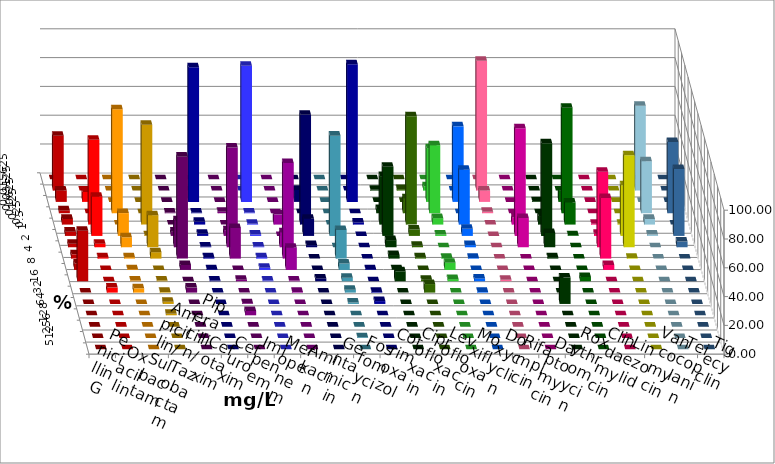
| Category | Penicillin G | Oxacillin | Ampicillin/ Sulbactam | Piperacillin/ Tazobactam | Cefotaxim | Cefuroxim | Imipenem | Meropenem | Amikacin | Gentamicin | Fosfomycin | Cotrimoxazol | Ciprofloxacin | Levofloxacin | Moxifloxacin | Doxycyclin | Rifampicin | Daptomycin | Roxythromycin | Clindamycin | Linezolid | Vancomycin | Teicoplanin | Tigecyclin |
|---|---|---|---|---|---|---|---|---|---|---|---|---|---|---|---|---|---|---|---|---|---|---|---|---|
| 0.015625 | 0 | 0 | 0 | 0 | 0 | 0 | 0 | 0 | 0 | 0 | 0 | 0 | 0 | 0 | 0 | 0 | 0 | 0 | 0 | 0 | 0 | 0 | 0 | 0 |
| 0.03125 | 38.119 | 0 | 0 | 0 | 0 | 0 | 0 | 0 | 0 | 0 | 0 | 0 | 0.495 | 0.99 | 2.985 | 0 | 90.099 | 0 | 0 | 0 | 0 | 0 | 0 | 58.911 |
| 0.0625 | 7.921 | 6.931 | 0 | 0 | 0 | 0 | 93.564 | 94.554 | 0 | 8.416 | 0 | 95.545 | 0 | 0 | 37.313 | 52.475 | 7.921 | 0 | 0.495 | 7.921 | 0 | 0 | 0 | 0 |
| 0.125 | 1.98 | 0 | 72.277 | 0 | 0.495 | 0.99 | 0.495 | 0.495 | 0 | 0 | 0 | 0 | 2.97 | 10.396 | 47.264 | 0 | 0.99 | 0 | 0 | 73.267 | 0 | 0 | 49.505 | 36.139 |
| 0.25 | 3.96 | 58.911 | 0 | 69.307 | 0 | 0 | 1.98 | 0.495 | 6.931 | 76.238 | 0 | 1.485 | 33.663 | 75.248 | 4.478 | 38.119 | 0 | 4.95 | 5.941 | 15.347 | 0.495 | 0.495 | 0 | 3.96 |
| 0.5 | 2.97 | 27.228 | 15.842 | 0.495 | 2.97 | 3.96 | 1.485 | 0.99 | 0 | 11.881 | 69.652 | 0 | 48.02 | 4.455 | 0.995 | 4.95 | 0 | 74.752 | 64.356 | 0.495 | 1.485 | 35.149 | 46.535 | 0.99 |
| 1.0 | 2.475 | 2.475 | 6.931 | 22.277 | 18.812 | 69.307 | 0.495 | 0.495 | 10.396 | 1.485 | 0 | 0 | 4.95 | 0.99 | 0 | 1.485 | 0 | 20.297 | 9.901 | 0 | 52.475 | 63.861 | 3.96 | 0 |
| 2.0 | 2.97 | 0.99 | 0.99 | 4.455 | 70.792 | 21.287 | 0.99 | 0.99 | 66.337 | 0 | 19.9 | 0 | 2.475 | 0.99 | 0.498 | 0.495 | 0 | 0 | 0.99 | 0 | 42.079 | 0.495 | 0 | 0 |
| 4.0 | 4.455 | 0 | 0.495 | 0 | 3.465 | 0 | 0.495 | 1.485 | 15.347 | 0 | 4.478 | 0.495 | 0.495 | 0 | 4.975 | 0 | 0 | 0 | 0 | 0 | 3.465 | 0 | 0 | 0 |
| 8.0 | 35.149 | 0 | 0.495 | 0.495 | 0 | 0.99 | 0.495 | 0.495 | 0.495 | 1.98 | 2.488 | 0 | 6.931 | 0.99 | 1.493 | 1.98 | 0.99 | 0 | 0 | 2.97 | 0 | 0 | 0 | 0 |
| 16.0 | 0 | 3.465 | 2.97 | 0.495 | 3.465 | 0 | 0 | 0 | 0.495 | 0 | 1.99 | 0.495 | 0 | 5.941 | 0 | 0.495 | 0 | 0 | 0 | 0 | 0 | 0 | 0 | 0 |
| 32.0 | 0 | 0 | 0 | 1.485 | 0 | 0.495 | 0 | 0 | 0 | 0 | 0.995 | 1.98 | 0 | 0 | 0 | 0 | 0 | 0 | 18.317 | 0 | 0 | 0 | 0 | 0 |
| 64.0 | 0 | 0 | 0 | 0.99 | 0 | 2.97 | 0 | 0 | 0 | 0 | 0 | 0 | 0 | 0 | 0 | 0 | 0 | 0 | 0 | 0 | 0 | 0 | 0 | 0 |
| 128.0 | 0 | 0 | 0 | 0 | 0 | 0 | 0 | 0 | 0 | 0 | 0 | 0 | 0 | 0 | 0 | 0 | 0 | 0 | 0 | 0 | 0 | 0 | 0 | 0 |
| 256.0 | 0 | 0 | 0 | 0 | 0 | 0 | 0 | 0 | 0 | 0 | 0.498 | 0 | 0 | 0 | 0 | 0 | 0 | 0 | 0 | 0 | 0 | 0 | 0 | 0 |
| 512.0 | 0 | 0 | 0 | 0 | 0 | 0 | 0 | 0 | 0 | 0 | 0 | 0 | 0 | 0 | 0 | 0 | 0 | 0 | 0 | 0 | 0 | 0 | 0 | 0 |